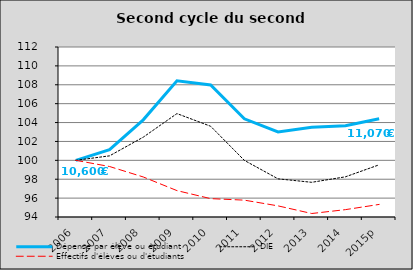
| Category | Dépense par élève ou étudiant  | DIE | Effectifs d'élèves ou d'étudiants |
|---|---|---|---|
| 2006 | 100 | 100 | 100 |
| 2007 | 101.137 | 100.475 | 99.346 |
| 2008 | 104.288 | 102.451 | 98.239 |
| 2009 | 108.424 | 104.949 | 96.795 |
| 2010 | 107.988 | 103.608 | 95.944 |
| 2011 | 104.396 | 99.995 | 95.784 |
| 2012 | 103.009 | 98.041 | 95.177 |
| 2013 | 103.501 | 97.674 | 94.37 |
| 2014 | 103.667 | 98.255 | 94.779 |
| 2015p | 104.399 | 99.526 | 95.332 |